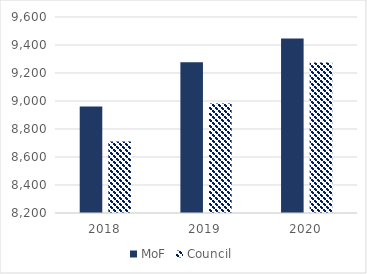
| Category | MoF | Council |
|---|---|---|
| 2018.0 | 8960.544 | 8711.33 |
| 2019.0 | 9276.348 | 8982.901 |
| 2020.0 | 9446.527 | 9274.982 |